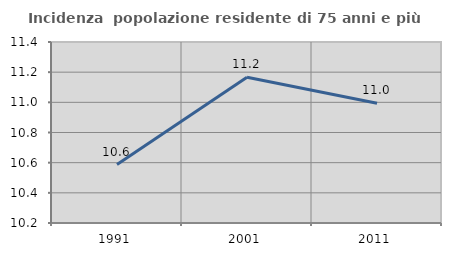
| Category | Incidenza  popolazione residente di 75 anni e più |
|---|---|
| 1991.0 | 10.587 |
| 2001.0 | 11.166 |
| 2011.0 | 10.993 |